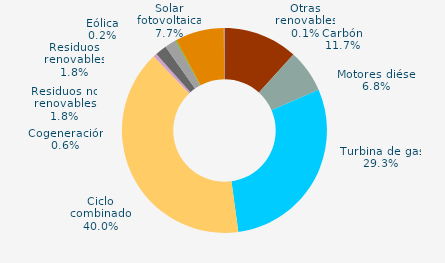
| Category | Series 0 |
|---|---|
| Carbón | 11.731 |
| Motores diésel | 6.78 |
| Turbina de gas | 29.333 |
| Ciclo combinado | 40.023 |
| Generación auxiliar | 0 |
| Cogeneración | 0.56 |
| Residuos no renovables | 1.819 |
| Residuos renovables | 1.819 |
| Eólica | 0.175 |
| Solar fotovoltaica | 7.655 |
| Otras renovables | 0.104 |